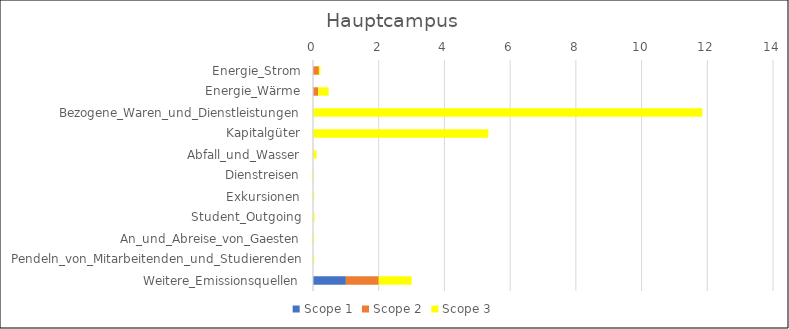
| Category | Scope 1 | Scope 2 | Scope 3 |
|---|---|---|---|
| Energie_Strom | 0 | 0.179 | 0.047 |
| Energie_Wärme | 0.009 | 0.148 | 0.32 |
| Bezogene_Waren_und_Dienstleistungen | 0 | 0 | 11.85 |
| Kapitalgüter | 0 | 0 | 5.335 |
| Abfall_und_Wasser | 0 | 0 | 0.106 |
| Dienstreisen | 0 | 0 | 0.032 |
| Exkursionen | 0 | 0 | 0.035 |
| Student_Outgoing | 0 | 0 | 0.046 |
| An_und_Abreise_von_Gaesten | 0 | 0 | 0.035 |
| Pendeln_von_Mitarbeitenden_und_Studierenden | 0 | 0 | 0.035 |
| Weitere_Emissionsquellen | 1 | 1 | 1 |